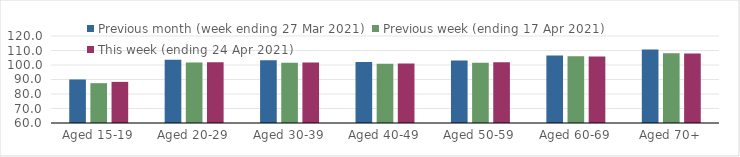
| Category | Previous month (week ending 27 Mar 2021) | Previous week (ending 17 Apr 2021) | This week (ending 24 Apr 2021) |
|---|---|---|---|
| Aged 15-19 | 90.02 | 87.47 | 88.36 |
| Aged 20-29 | 103.68 | 101.7 | 101.85 |
| Aged 30-39 | 103.2 | 101.54 | 101.81 |
| Aged 40-49 | 102.11 | 100.8 | 101.02 |
| Aged 50-59 | 103.12 | 101.6 | 101.83 |
| Aged 60-69 | 106.53 | 106.07 | 105.89 |
| Aged 70+ | 110.67 | 108.12 | 108 |